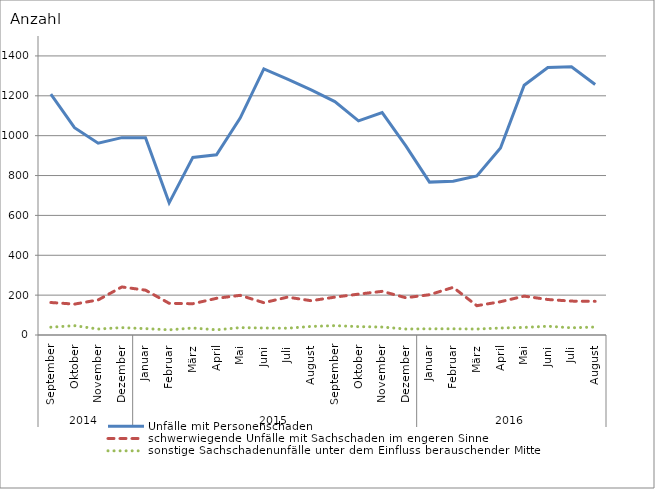
| Category | Unfälle mit Personenschaden | schwerwiegende Unfälle mit Sachschaden im engeren Sinne | sonstige Sachschadenunfälle unter dem Einfluss berauschender Mittel |
|---|---|---|---|
| 0 | 1208 | 163 | 39 |
| 1 | 1040 | 155 | 47 |
| 2 | 962 | 176 | 30 |
| 3 | 990 | 241 | 37 |
| 4 | 990 | 225 | 32 |
| 5 | 663 | 159 | 26 |
| 6 | 891 | 157 | 35 |
| 7 | 904 | 184 | 26 |
| 8 | 1088 | 199 | 37 |
| 9 | 1335 | 162 | 35 |
| 10 | 1284 | 190 | 34 |
| 11 | 1230 | 172 | 43 |
| 12 | 1171 | 190 | 47 |
| 13 | 1074 | 205 | 42 |
| 14 | 1116 | 219 | 40 |
| 15 | 949 | 187 | 30 |
| 16 | 767 | 202 | 31 |
| 17 | 771 | 239 | 31 |
| 18 | 798 | 147 | 30 |
| 19 | 938 | 167 | 35 |
| 20 | 1253 | 195 | 38 |
| 21 | 1342 | 178 | 44 |
| 22 | 1346 | 170 | 36 |
| 23 | 1257 | 169 | 40 |